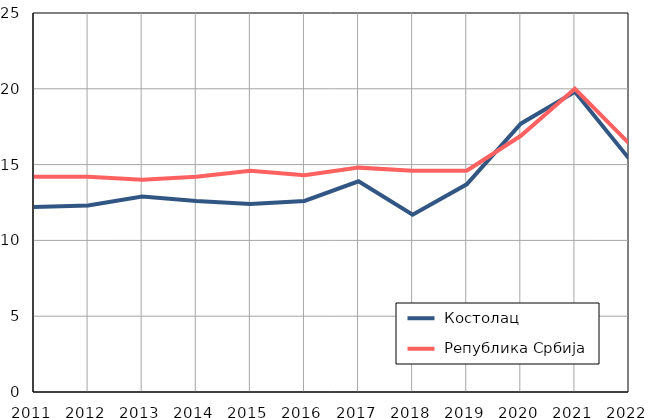
| Category |  Костолац |  Република Србија |
|---|---|---|
| 2011.0 | 12.2 | 14.2 |
| 2012.0 | 12.3 | 14.2 |
| 2013.0 | 12.9 | 14 |
| 2014.0 | 12.6 | 14.2 |
| 2015.0 | 12.4 | 14.6 |
| 2016.0 | 12.6 | 14.3 |
| 2017.0 | 13.9 | 14.8 |
| 2018.0 | 11.7 | 14.6 |
| 2019.0 | 13.7 | 14.6 |
| 2020.0 | 17.7 | 16.9 |
| 2021.0 | 19.8 | 20 |
| 2022.0 | 15.4 | 16.4 |